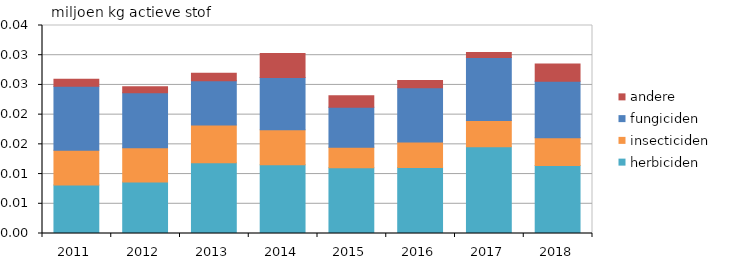
| Category | herbiciden | insecticiden | fungiciden | andere |
|---|---|---|---|---|
| 2011.0 | 8159.4 | 5864.893 | 10749.217 | 1172.885 |
| 2012.0 | 8661.371 | 5770.472 | 9248.667 | 1009.924 |
| 2013.0 | 11925.266 | 6332.69 | 7439.603 | 1265.061 |
| 2014.0 | 11575.48 | 5896.823 | 8793.774 | 4007.978 |
| 2015.0 | 11071.568 | 3423.047 | 6768.629 | 1913.382 |
| 2016.0 | 11124.398 | 4267.043 | 9138.613 | 1233.879 |
| 2017.0 | 14578.335 | 4417.392 | 10631.209 | 814.213 |
| 2018.0 | 11459.33 | 4652.242 | 9516.876 | 2911.455 |